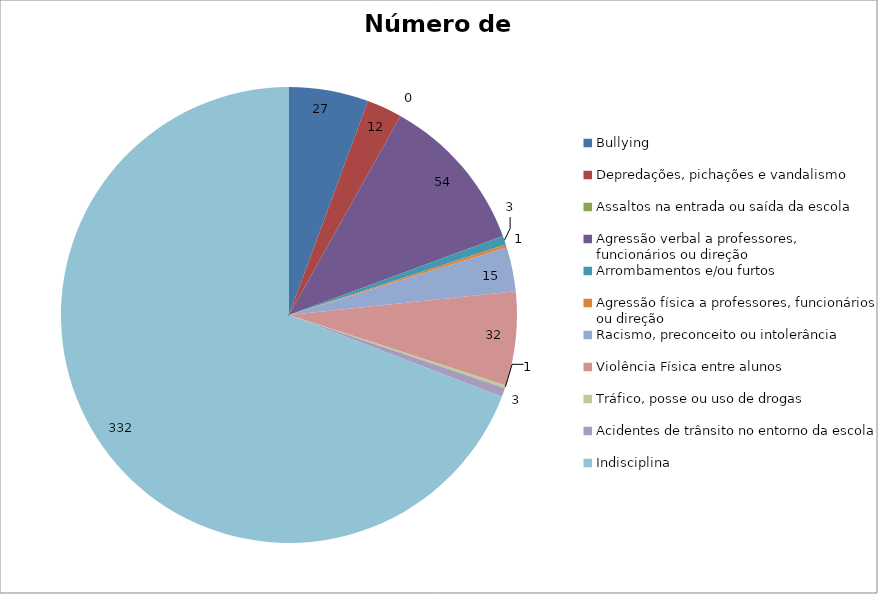
| Category | Número de Casos |
|---|---|
| Bullying | 27 |
| Depredações, pichações e vandalismo | 12 |
| Assaltos na entrada ou saída da escola | 0 |
| Agressão verbal a professores, funcionários ou direção | 54 |
| Arrombamentos e/ou furtos | 3 |
| Agressão física a professores, funcionários ou direção | 1 |
| Racismo, preconceito ou intolerância | 15 |
| Violência Física entre alunos | 32 |
| Tráfico, posse ou uso de drogas | 1 |
| Acidentes de trânsito no entorno da escola | 3 |
| Indisciplina | 332 |